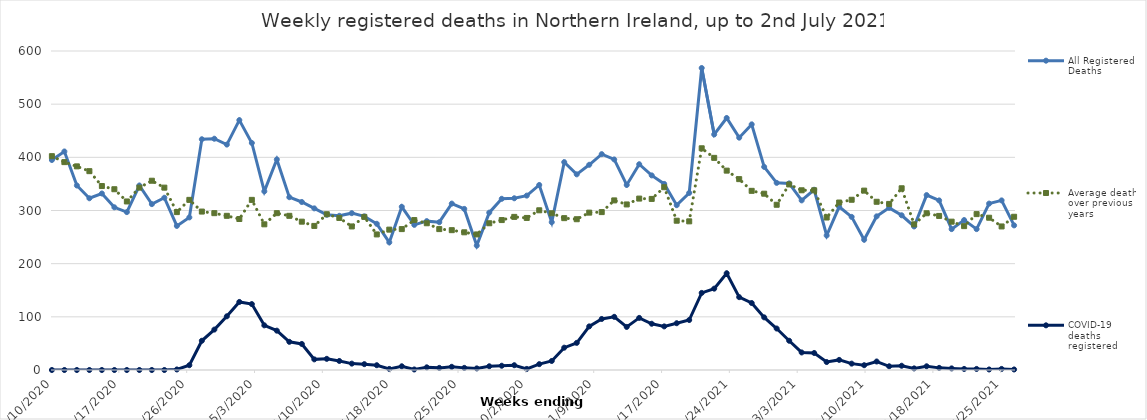
| Category | All Registered Deaths | Average deaths over previous 5 years | COVID-19 deaths registered |
|---|---|---|---|
| 1/10/20 | 395 | 402.2 | 0 |
| 1/17/20 | 411 | 391 | 0 |
| 1/24/20 | 347 | 383 | 0 |
| 1/31/20 | 323 | 374 | 0 |
| 2/7/20 | 332 | 346 | 0 |
| 2/14/20 | 306 | 340 | 0 |
| 2/21/20 | 297 | 317 | 0 |
| 2/28/20 | 347 | 343 | 0 |
| 3/6/20 | 312 | 356 | 0 |
| 3/13/20 | 324 | 343 | 0 |
| 3/20/20 | 271 | 297 | 1 |
| 3/27/20 | 287 | 320 | 9 |
| 4/3/20 | 434 | 298 | 55 |
| 4/10/20 | 435 | 295 | 76 |
| 4/17/20 | 424 | 290 | 101 |
| 4/24/20 | 470 | 284 | 128 |
| 5/1/20 | 427 | 320 | 124 |
| 5/8/20 | 336 | 274 | 84 |
| 5/15/20 | 396 | 295 | 74 |
| 5/22/20 | 325 | 290 | 53 |
| 5/29/20 | 316 | 279 | 49 |
| 6/5/20 | 304 | 271 | 20 |
| 6/12/20 | 292 | 293 | 21 |
| 6/19/20 | 290 | 286 | 17 |
| 6/26/20 | 295 | 270 | 12 |
| 7/3/20 | 289 | 288 | 11 |
| 7/10/20 | 275 | 255 | 9 |
| 7/17/20 | 240 | 264 | 2 |
| 7/24/20 | 307 | 265 | 7 |
| 7/31/20 | 273 | 282 | 1 |
| 8/7/20 | 280 | 276 | 5 |
| 8/14/20 | 278 | 265 | 4 |
| 8/21/20 | 313 | 263 | 6 |
| 8/28/20 | 303 | 259 | 4 |
| 9/4/20 | 234 | 255 | 3 |
| 9/11/20 | 296 | 276 | 7 |
| 9/18/20 | 322 | 282 | 8 |
| 9/25/20 | 323 | 288 | 9 |
| 10/2/20 | 328 | 286 | 2 |
| 10/9/20 | 348 | 300.4 | 11 |
| 10/16/20 | 278 | 294.8 | 17 |
| 10/23/20 | 391 | 285.6 | 42 |
| 10/30/20 | 368 | 283.6 | 51 |
| 11/6/20 | 386 | 296 | 82 |
| 11/13/20 | 406 | 297 | 96 |
| 11/20/20 | 396 | 319 | 100 |
| 11/27/20 | 348 | 311.4 | 81 |
| 12/4/20 | 387 | 322.4 | 98 |
| 12/11/20 | 366 | 321.8 | 87 |
| 12/18/20 | 350 | 343.8 | 82 |
| 12/25/20 | 310 | 280.8 | 88 |
| 1/1/21 | 333 | 279.6 | 94 |
| 1/8/21 | 568 | 417 | 145 |
| 1/15/21 | 443 | 399 | 153 |
| 1/22/21 | 474 | 375 | 182 |
| 1/29/21 | 437 | 359 | 137 |
| 2/5/21 | 462 | 337 | 126 |
| 2/12/21 | 382 | 331.6 | 99 |
| 2/19/21 | 352 | 310.8 | 78 |
| 2/26/21 | 351 | 349 | 55 |
| 3/5/21 | 319 | 338 | 33 |
| 3/12/21 | 339 | 338 | 32 |
| 3/19/21 | 253 | 286.8 | 15 |
| 3/26/21 | 307 | 315 | 19 |
| 4/2/21 | 288 | 320.2 | 12 |
| 4/9/21 | 245 | 337.4 | 9 |
| 4/16/21 | 289 | 316.4 | 16 |
| 4/23/21 | 305 | 312.4 | 7 |
| 4/30/21 | 291 | 341.8 | 8 |
| 5/7/21 | 270 | 274 | 3 |
| 5/14/21 | 329 | 294.8 | 7 |
| 5/21/21 | 319 | 289.8 | 4 |
| 5/28/21 | 265 | 279 | 3 |
| 6/4/21 | 282 | 270.6 | 2 |
| 6/11/21 | 265 | 293.2 | 2 |
| 6/18/21 | 313 | 286.4 | 1 |
| 6/25/21 | 319 | 270 | 2 |
| 7/2/21 | 272 | 288.2 | 1 |